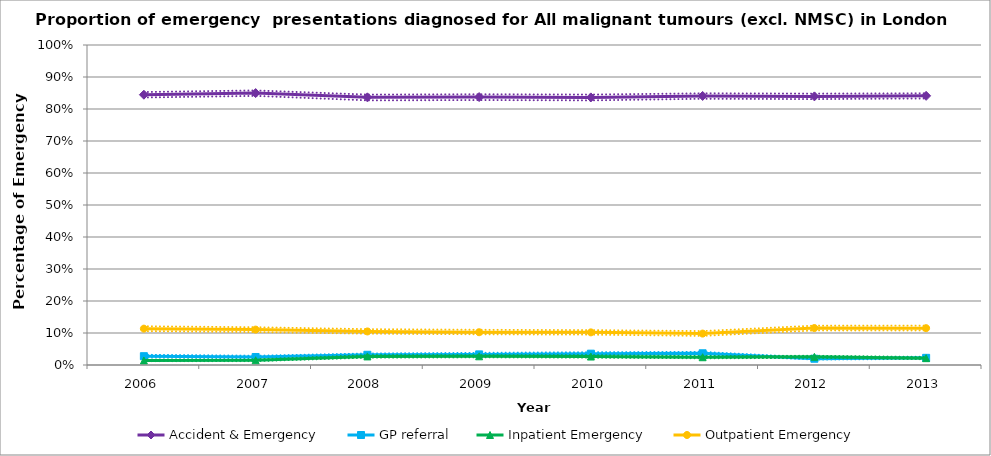
| Category | Accident & Emergency | Series 1 | Series 2 | GP referral | Series 4 | Series 5 | Inpatient Emergency | Series 7 | Series 8 | Outpatient Emergency | Series 10 | Series 11 |
|---|---|---|---|---|---|---|---|---|---|---|---|---|
| 2006.0 | 0.845 | 0.836 | 0.853 | 0.028 | 0.024 | 0.032 | 0.014 | 0.012 | 0.017 | 0.114 | 0.106 | 0.121 |
| 2007.0 | 0.85 | 0.841 | 0.858 | 0.025 | 0.022 | 0.029 | 0.015 | 0.012 | 0.018 | 0.111 | 0.103 | 0.118 |
| 2008.0 | 0.836 | 0.827 | 0.845 | 0.032 | 0.028 | 0.036 | 0.027 | 0.023 | 0.031 | 0.105 | 0.098 | 0.112 |
| 2009.0 | 0.837 | 0.828 | 0.846 | 0.033 | 0.029 | 0.038 | 0.027 | 0.024 | 0.031 | 0.102 | 0.096 | 0.11 |
| 2010.0 | 0.836 | 0.827 | 0.845 | 0.035 | 0.031 | 0.04 | 0.026 | 0.023 | 0.031 | 0.102 | 0.095 | 0.109 |
| 2011.0 | 0.841 | 0.832 | 0.849 | 0.037 | 0.032 | 0.041 | 0.024 | 0.021 | 0.028 | 0.098 | 0.091 | 0.106 |
| 2012.0 | 0.839 | 0.831 | 0.848 | 0.02 | 0.017 | 0.023 | 0.026 | 0.022 | 0.029 | 0.115 | 0.108 | 0.123 |
| 2013.0 | 0.841 | 0.833 | 0.849 | 0.022 | 0.019 | 0.026 | 0.021 | 0.018 | 0.025 | 0.115 | 0.108 | 0.123 |